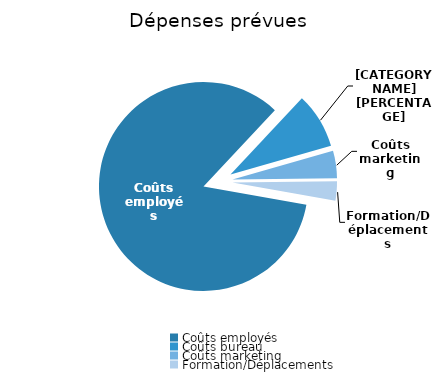
| Category | Series 0 |
|---|---|
| Coûts employés | 1355090 |
| Coûts bureau | 138740 |
| Coûts marketing | 67800 |
| Formation/Déplacements | 48000 |